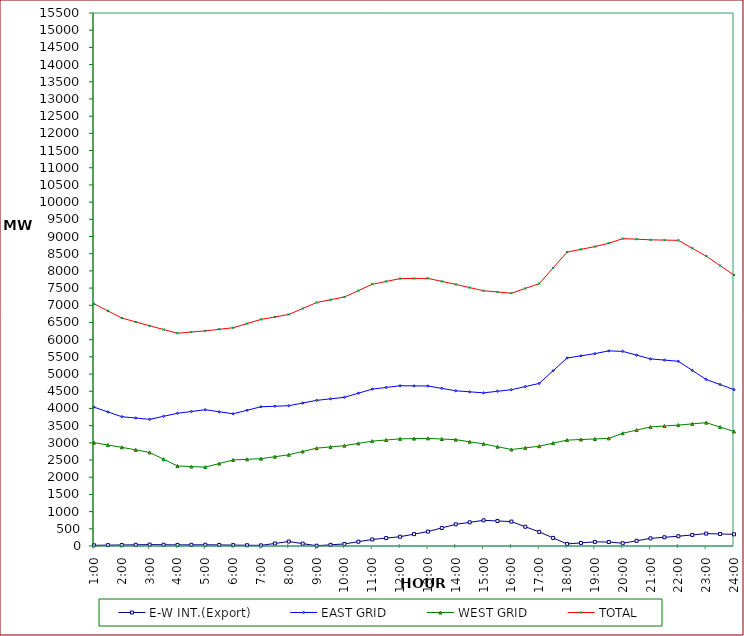
| Category | E-W INT.(Export) | EAST GRID | WEST GRID | TOTAL |
|---|---|---|---|---|
| 1:00 | 20 | 4038 | 3005 | 7043 |
| 1:30 | 25 | 3899 | 2937 | 6836 |
| 2:00 | 30 | 3760 | 2869 | 6629 |
| 2:30 | 35 | 3721.5 | 2795 | 6516.5 |
| 3:00 | 40 | 3683 | 2721 | 6404 |
| 3:30 | 36 | 3771.5 | 2524 | 6295.5 |
| 4:00 | 32 | 3860 | 2327 | 6187 |
| 4:30 | 34 | 3911.5 | 2310.5 | 6222 |
| 5:00 | 36 | 3963 | 2294 | 6257 |
| 5:30 | 31 | 3904 | 2398 | 6302 |
| 6:00 | 26 | 3845 | 2502 | 6347 |
| 6:30 | 22 | 3947 | 2521 | 6468 |
| 7:00 | 18 | 4049 | 2540 | 6589 |
| 7:30 | 74 | 4064.5 | 2596.5 | 6661 |
| 8:00 | 130 | 4080 | 2653 | 6733 |
| 8:30 | 69 | 4157.5 | 2749 | 6906.5 |
| 9:00 | 8 | 4235 | 2845 | 7080 |
| 9:30 | 34 | 4279.5 | 2881.5 | 7161 |
| 10:00 | 60 | 4324 | 2918 | 7242 |
| 10:30 | 125 | 4443 | 2983.5 | 7426.5 |
| 11:00 | 190 | 4562 | 3049 | 7611 |
| 11:30 | 230 | 4611 | 3082.5 | 7693.5 |
| 12:00 | 270 | 4660 | 3116 | 7776 |
| 12:30 | 345 | 4656.5 | 3123 | 7779.5 |
| 13:00 | 420 | 4653 | 3130 | 7783 |
| 13:30 | 525 | 4583.5 | 3111.5 | 7695 |
| 14:00 | 630 | 4514 | 3093 | 7607 |
| 14:30 | 688 | 4483.5 | 3031.5 | 7515 |
| 15:00 | 746 | 4453 | 2970 | 7423 |
| 15:30 | 728 | 4499 | 2888 | 7387 |
| 16:00 | 710 | 4545 | 2806 | 7351 |
| 16:30 | 560 | 4636.5 | 2854 | 7490.5 |
| 17:00 | 410 | 4728 | 2902 | 7630 |
| 17:30 | 235 | 5097.5 | 2990.5 | 8088 |
| 18:00 | 60 | 5467 | 3079 | 8546 |
| 18:30 | 90 | 5530.5 | 3096 | 8626.5 |
| 19:00 | 120 | 5594 | 3113 | 8707 |
| 19:30 | 116 | 5674 | 3130 | 8804 |
| 20:00 | 80 | 5660 | 3279 | 8939 |
| 20:30 | 151 | 5550.5 | 3371 | 8921.5 |
| 21:00 | 222 | 5441 | 3463 | 8904 |
| 21:30 | 253 | 5406.5 | 3489.5 | 8896 |
| 22:00 | 284 | 5372 | 3516 | 8888 |
| 22:30 | 322 | 5107.5 | 3551.5 | 8659 |
| 23:00 | 360 | 4843 | 3587 | 8430 |
| 23:30 | 350 | 4695.5 | 3459 | 8154.5 |
| 24:00 | 340 | 4548 | 3331 | 7879 |